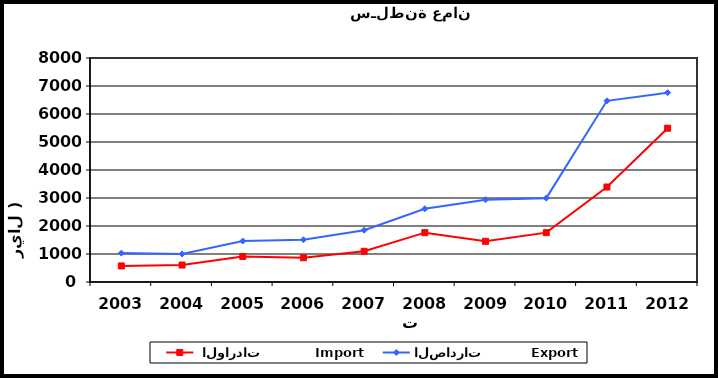
| Category |  الواردات           Import | الصادرات          Export |
|---|---|---|
| 2003.0 | 574 | 1032 |
| 2004.0 | 606 | 1001 |
| 2005.0 | 910 | 1463 |
| 2006.0 | 865 | 1510 |
| 2007.0 | 1097 | 1851 |
| 2008.0 | 1762 | 2617 |
| 2009.0 | 1453 | 2940 |
| 2010.0 | 1762 | 2995 |
| 2011.0 | 3392 | 6471 |
| 2012.0 | 5493 | 6762 |